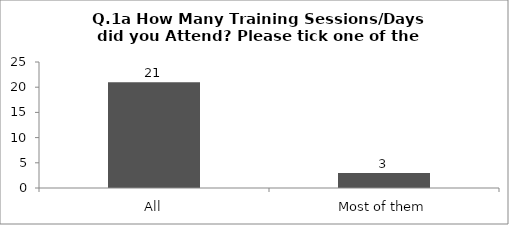
| Category | Q.1a How Many Training Sessions/Days did you Attend? Please tick one of the answers below |
|---|---|
| All | 21 |
| Most of them | 3 |